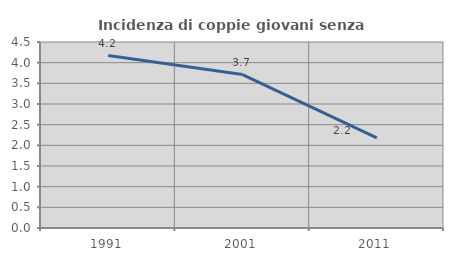
| Category | Incidenza di coppie giovani senza figli |
|---|---|
| 1991.0 | 4.171 |
| 2001.0 | 3.712 |
| 2011.0 | 2.181 |